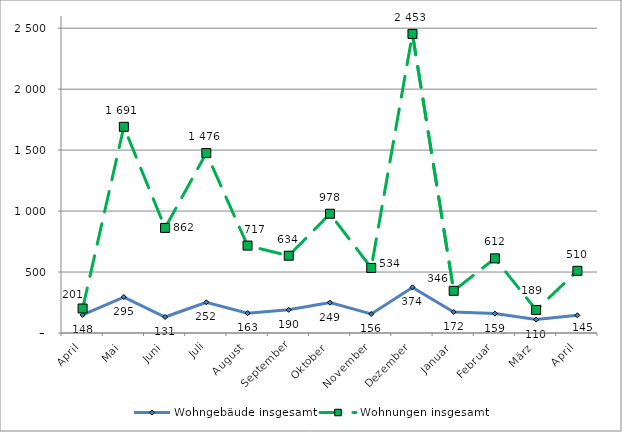
| Category | Wohngebäude insgesamt | Wohnungen insgesamt |
|---|---|---|
| April | 148 | 201 |
| Mai | 295 | 1691 |
| Juni | 131 | 862 |
| Juli | 252 | 1476 |
| August | 163 | 717 |
| September | 190 | 634 |
| Oktober | 249 | 978 |
| November | 156 | 534 |
| Dezember | 374 | 2453 |
| Januar | 172 | 346 |
| Februar | 159 | 612 |
| März | 110 | 189 |
| April | 145 | 510 |